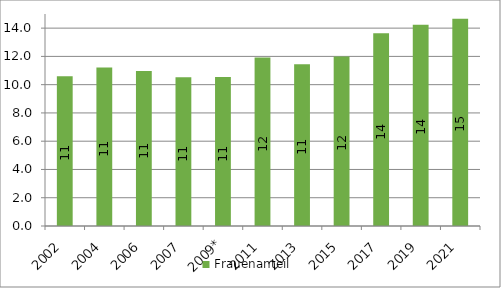
| Category | Frauenanteil |
|---|---|
| 2002 | 10.597 |
| 2004 | 11.212 |
| 2006 | 10.966 |
| 2007 | 10.526 |
| 2009* | 10.536 |
| 2011 | 11.926 |
| 2013 | 11.447 |
| 2015 | 12.001 |
| 2017 | 13.639 |
| 2019 | 14.233 |
| 2021 | 14.667 |